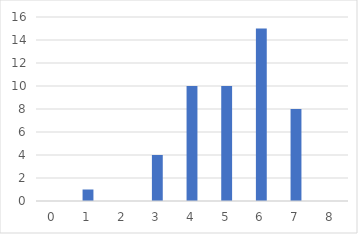
| Category | Series 0 |
|---|---|
| 0.0 | 0 |
| 1.0 | 1 |
| 2.0 | 0 |
| 3.0 | 4 |
| 4.0 | 10 |
| 5.0 | 10 |
| 6.0 | 15 |
| 7.0 | 8 |
| 8.0 | 0 |